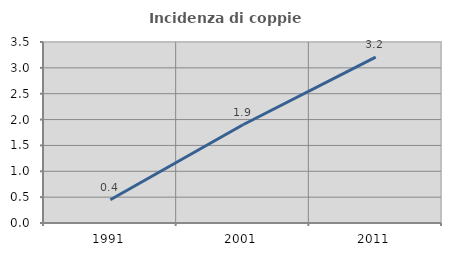
| Category | Incidenza di coppie miste |
|---|---|
| 1991.0 | 0.45 |
| 2001.0 | 1.9 |
| 2011.0 | 3.207 |